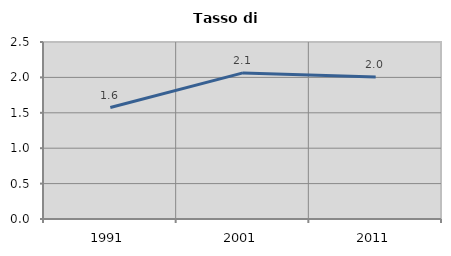
| Category | Tasso di disoccupazione   |
|---|---|
| 1991.0 | 1.575 |
| 2001.0 | 2.063 |
| 2011.0 | 2.005 |